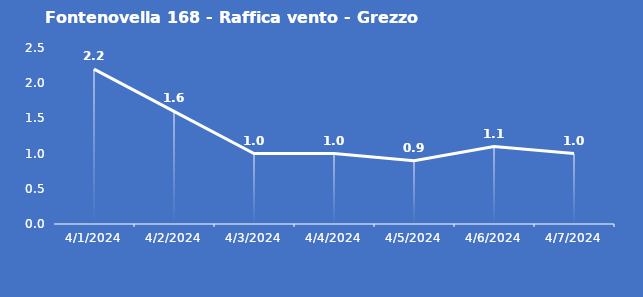
| Category | Fontenovella 168 - Raffica vento - Grezzo (m/s) |
|---|---|
| 4/1/24 | 2.2 |
| 4/2/24 | 1.6 |
| 4/3/24 | 1 |
| 4/4/24 | 1 |
| 4/5/24 | 0.9 |
| 4/6/24 | 1.1 |
| 4/7/24 | 1 |